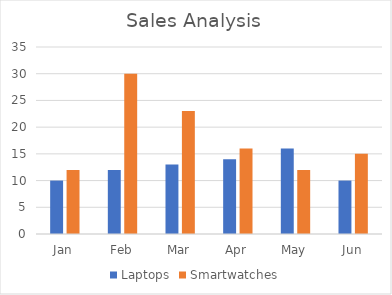
| Category | Laptops | Smartwatches |
|---|---|---|
| Jan | 10 | 12 |
| Feb | 12 | 30 |
| Mar | 13 | 23 |
| Apr | 14 | 16 |
| May | 16 | 12 |
| Jun | 10 | 15 |